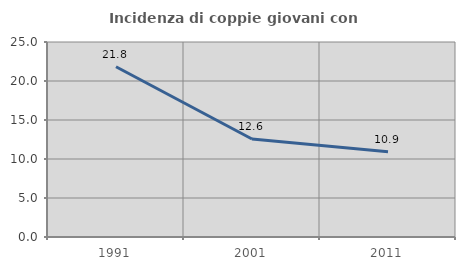
| Category | Incidenza di coppie giovani con figli |
|---|---|
| 1991.0 | 21.825 |
| 2001.0 | 12.565 |
| 2011.0 | 10.935 |